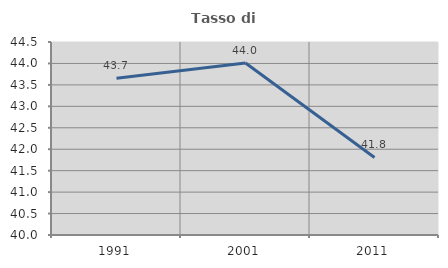
| Category | Tasso di occupazione   |
|---|---|
| 1991.0 | 43.654 |
| 2001.0 | 44.011 |
| 2011.0 | 41.808 |